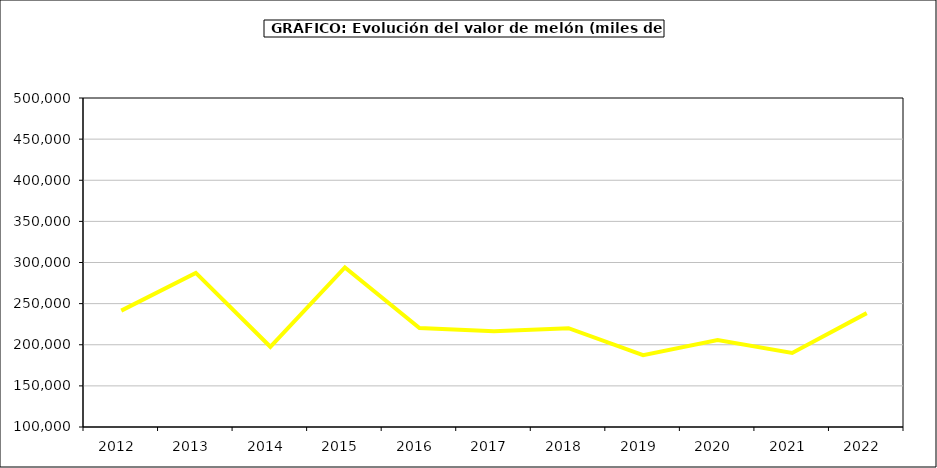
| Category | Valor |
|---|---|
| 2012.0 | 241464.672 |
| 2013.0 | 287421.365 |
| 2014.0 | 197555.814 |
| 2015.0 | 293985.4 |
| 2016.0 | 220336 |
| 2017.0 | 216504.545 |
| 2018.0 | 220100.149 |
| 2019.0 | 187296.187 |
| 2020.0 | 205838.488 |
| 2021.0 | 190103.254 |
| 2022.0 | 238435.925 |